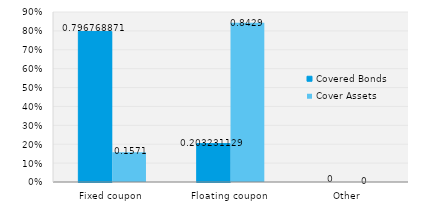
| Category | Covered Bonds | Cover Assets |
|---|---|---|
| Fixed coupon | 0.797 | 0.157 |
| Floating coupon | 0.203 | 0.843 |
| Other | 0 | 0 |